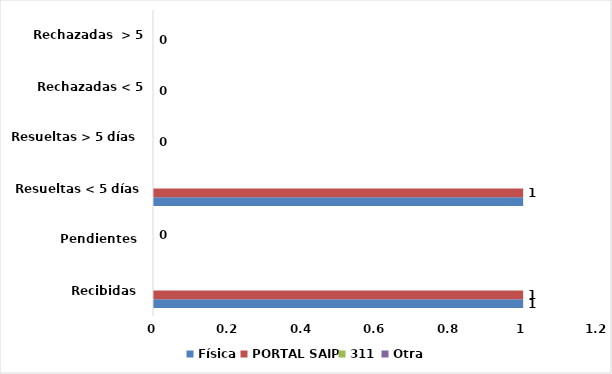
| Category | Física | PORTAL SAIP | 311 | Otra |
|---|---|---|---|---|
| Recibidas  | 1 | 1 | 0 | 0 |
| Pendientes  | 0 | 0 | 0 | 0 |
| Resueltas < 5 días | 1 | 1 | 0 | 0 |
| Resueltas > 5 días  | 0 | 0 | 0 | 0 |
| Rechazadas < 5 días  | 0 | 0 | 0 | 0 |
| Rechazadas  > 5 días | 0 | 0 | 0 | 0 |